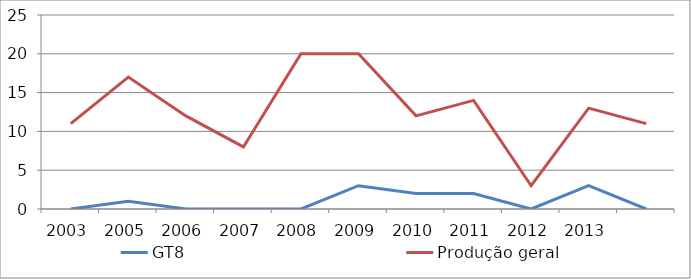
| Category | GT8 | Produção geral |
|---|---|---|
| 2003.0 | 0 | 11 |
| 2005.0 | 1 | 17 |
| 2006.0 | 0 | 12 |
| 2007.0 | 0 | 8 |
| 2008.0 | 0 | 20 |
| 2009.0 | 3 | 20 |
| 2010.0 | 2 | 12 |
| 2011.0 | 2 | 14 |
| 2012.0 | 0 | 3 |
| 2013.0 | 3 | 13 |